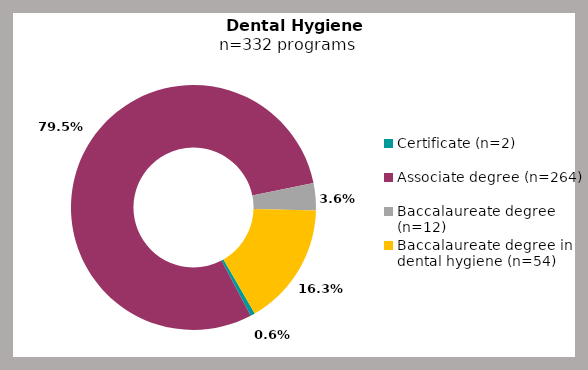
| Category | Series 0 |
|---|---|
| Certificate (n=2) | 0.006 |
| Associate degree (n=264) | 0.795 |
| Baccalaureate degree (n=12) | 0.036 |
| Baccalaureate degree in dental hygiene (n=54) | 0.163 |